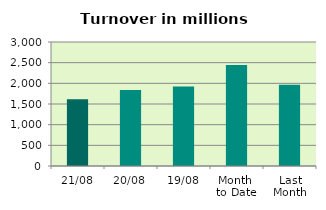
| Category | Series 0 |
|---|---|
| 21/08 | 1617.003 |
| 20/08 | 1837.134 |
| 19/08 | 1920.619 |
| Month 
to Date | 2446.323 |
| Last
Month | 1965.856 |